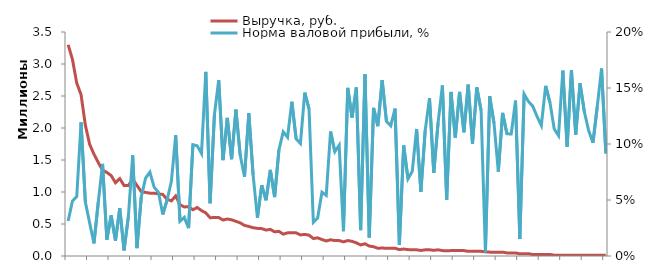
| Category | Выручка, руб. |
|---|---|
| 0 | 3300000 |
| 1 | 3072281 |
| 2 | 2700500 |
| 3 | 2520630 |
| 4 | 2044748 |
| 5 | 1744810 |
| 6 | 1590870 |
| 7 | 1460910 |
| 8 | 1340960 |
| 9 | 1305053 |
| 10 | 1257130 |
| 11 | 1145232 |
| 12 | 1209308 |
| 13 | 1101300 |
| 14 | 1101400 |
| 15 | 1201500 |
| 16 | 1101600 |
| 17 | 1005564 |
| 18 | 993638 |
| 19 | 981710 |
| 20 | 981800 |
| 21 | 969869 |
| 22 | 961870 |
| 23 | 885886 |
| 24 | 861920 |
| 25 | 937950 |
| 26 | 801950 |
| 27 | 765944 |
| 28 | 771960 |
| 29 | 721885 |
| 30 | 757890 |
| 31 | 709829 |
| 32 | 673792 |
| 33 | 597749 |
| 34 | 601700 |
| 35 | 601750 |
| 36 | 561800 |
| 37 | 577776 |
| 38 | 565786 |
| 39 | 541755 |
| 40 | 517720 |
| 41 | 477763 |
| 42 | 461680 |
| 43 | 441720 |
| 44 | 431760 |
| 45 | 427710 |
| 46 | 405702 |
| 47 | 415739 |
| 48 | 377584 |
| 49 | 385568 |
| 50 | 341500 |
| 51 | 361530 |
| 52 | 361560 |
| 53 | 361590 |
| 54 | 329566 |
| 55 | 337540 |
| 56 | 325512 |
| 57 | 273482 |
| 58 | 283508 |
| 59 | 257357 |
| 60 | 235320 |
| 61 | 253281 |
| 62 | 241240 |
| 63 | 241260 |
| 64 | 221280 |
| 65 | 241300 |
| 66 | 229254 |
| 67 | 205139 |
| 68 | 173088 |
| 69 | 191035 |
| 70 | 154980 |
| 71 | 144852 |
| 72 | 120720 |
| 73 | 124730 |
| 74 | 120350 |
| 75 | 120750 |
| 76 | 120760 |
| 77 | 99693 |
| 78 | 108702 |
| 79 | 99711 |
| 80 | 98720 |
| 81 | 96648 |
| 82 | 86656 |
| 83 | 96664 |
| 84 | 96672 |
| 85 | 88680 |
| 86 | 96688 |
| 87 | 84609 |
| 88 | 80616 |
| 89 | 84623 |
| 90 | 84630 |
| 91 | 84637 |
| 92 | 84644 |
| 93 | 72558 |
| 94 | 72564 |
| 95 | 72570 |
| 96 | 72576 |
| 97 | 65582 |
| 98 | 60490 |
| 99 | 60495 |
| 100 | 58500 |
| 101 | 60505 |
| 102 | 48408 |
| 103 | 46412 |
| 104 | 48416 |
| 105 | 33315 |
| 106 | 36318 |
| 107 | 36321 |
| 108 | 23216 |
| 109 | 24218 |
| 110 | 24220 |
| 111 | 24222 |
| 112 | 25224 |
| 113 | 12200 |
| 114 | 12190 |
| 115 | 12175 |
| 116 | 12160 |
| 117 | 12150 |
| 118 | 12135 |
| 119 | 12120 |
| 120 | 12120 |
| 121 | 12118 |
| 122 | 12116 |
| 123 | 12100 |
| 124 | 12100 |
| 125 | 12090 |